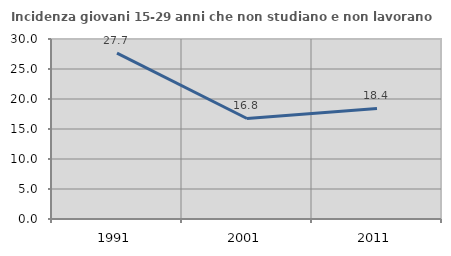
| Category | Incidenza giovani 15-29 anni che non studiano e non lavorano  |
|---|---|
| 1991.0 | 27.66 |
| 2001.0 | 16.751 |
| 2011.0 | 18.421 |